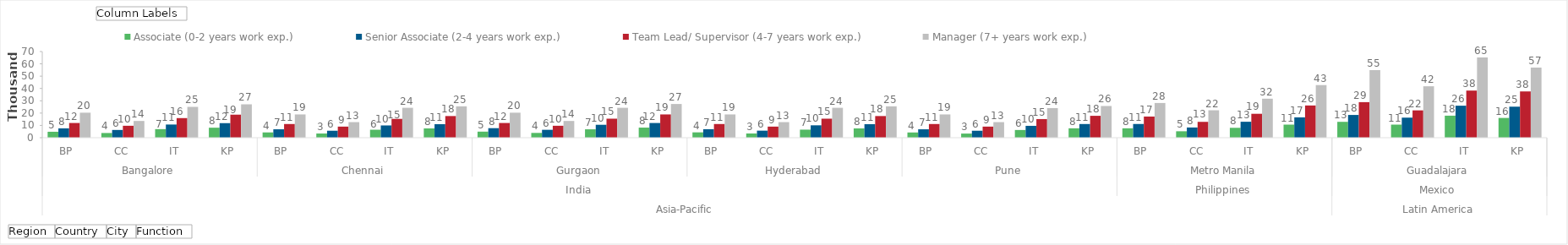
| Category | Associate (0-2 years work exp.)  | Senior Associate (2-4 years work exp.)  | Team Lead/ Supervisor (4-7 years work exp.)  | Manager (7+ years work exp.)  |
|---|---|---|---|---|
| 0 | 4834.281 | 7599.446 | 11960.222 | 20328.39 |
| 1 | 3825.266 | 6297.491 | 9694.414 | 13602.008 |
| 2 | 6966.149 | 10713.049 | 15928.388 | 25050.966 |
| 3 | 8128.393 | 11827.185 | 18717.675 | 27114.529 |
| 4 | 4302.51 | 6839.501 | 11123.006 | 18905.403 |
| 5 | 3404.487 | 5667.742 | 9015.805 | 12649.867 |
| 6 | 6478.519 | 9963.136 | 15291.252 | 24299.437 |
| 7 | 7559.405 | 10999.282 | 17594.615 | 25487.657 |
| 8 | 4930.967 | 7751.435 | 11960.222 | 20328.39 |
| 9 | 3901.772 | 6423.441 | 9694.414 | 13602.008 |
| 10 | 6826.826 | 10498.788 | 15450.536 | 24299.437 |
| 11 | 8209.677 | 11945.456 | 18904.852 | 27385.674 |
| 12 | 4350.853 | 6915.496 | 11123.006 | 18905.403 |
| 13 | 3442.74 | 5730.717 | 9015.805 | 12649.867 |
| 14 | 6548.18 | 10070.266 | 15450.536 | 24299.437 |
| 15 | 7559.405 | 10999.282 | 17594.615 | 25487.657 |
| 16 | 4254.167 | 6839.501 | 11123.006 | 18905.403 |
| 17 | 3366.234 | 5667.742 | 9015.805 | 12649.867 |
| 18 | 6269.534 | 9641.744 | 15131.968 | 24048.927 |
| 19 | 7640.689 | 11117.554 | 17781.792 | 25758.803 |
| 20 | 7635.507 | 11148.75 | 17185.266 | 28200.397 |
| 21 | 5233.476 | 8305.293 | 12879.864 | 22287.197 |
| 22 | 8038.459 | 12957.829 | 19430.254 | 31684.927 |
| 23 | 10629.988 | 16538.506 | 26173.999 | 42744.892 |
| 24 | 12894.748 | 18481.842 | 28886.085 | 54827.922 |
| 25 | 10629.862 | 16300.26 | 22203.42 | 41785.034 |
| 26 | 17898.742 | 26001.303 | 38282.465 | 65203.908 |
| 27 | 16056.864 | 25206.756 | 37593.544 | 56887.268 |